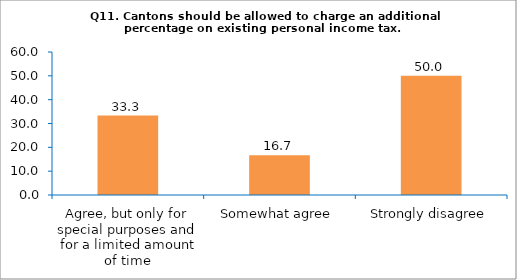
| Category | Series 0 |
|---|---|
| Agree, but only for special purposes and for a limited amount of time | 33.333 |
| Somewhat agree | 16.667 |
| Strongly disagree | 50 |